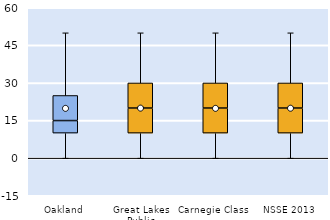
| Category | 25th | 50th | 75th |
|---|---|---|---|
| Oakland | 10 | 5 | 10 |
| Great Lakes Public | 10 | 10 | 10 |
| Carnegie Class | 10 | 10 | 10 |
| NSSE 2013 | 10 | 10 | 10 |